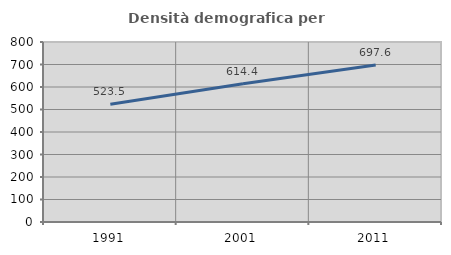
| Category | Densità demografica |
|---|---|
| 1991.0 | 523.531 |
| 2001.0 | 614.4 |
| 2011.0 | 697.573 |